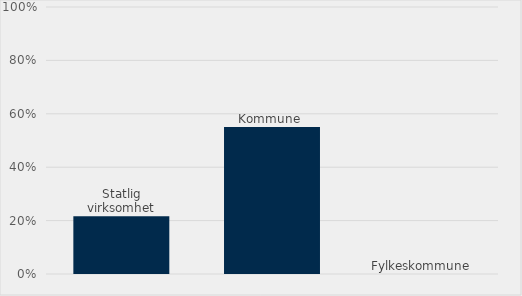
| Category | Series 0 |
|---|---|
| Statlig virksomhet | 0.216 |
| Kommune  | 0.55 |
| Fylkeskommune | 0 |